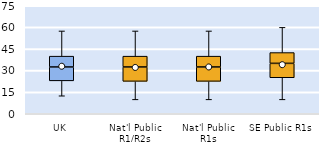
| Category | 25th | 50th | 75th |
|---|---|---|---|
| UK | 22.857 | 9.643 | 7.5 |
| Nat'l Public R1/R2s | 22.5 | 10 | 7.5 |
| Nat'l Public R1s | 22.5 | 10 | 7.5 |
| SE Public R1s | 25 | 10 | 7.5 |